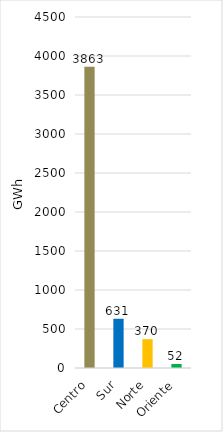
| Category | Series 0 |
|---|---|
| Centro | 3862.928 |
| Sur | 631.197 |
| Norte | 369.679 |
| Oriente | 51.7 |